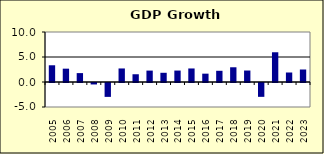
| Category | 2.8 |
|---|---|
| 2005.0 | 3.345 |
| 2006.0 | 2.666 |
| 2007.0 | 1.779 |
| 2008.0 | -0.292 |
| 2009.0 | -2.776 |
| 2010.0 | 2.709 |
| 2011.0 | 1.55 |
| 2012.0 | 2.281 |
| 2013.0 | 1.842 |
| 2014.0 | 2.288 |
| 2015.0 | 2.707 |
| 2016.0 | 1.668 |
| 2017.0 | 2.242 |
| 2018.0 | 2.945 |
| 2019.0 | 2.295 |
| 2020.0 | -2.768 |
| 2021.0 | 5.947 |
| 2022.0 | 1.9 |
| 2023.0 | 2.5 |